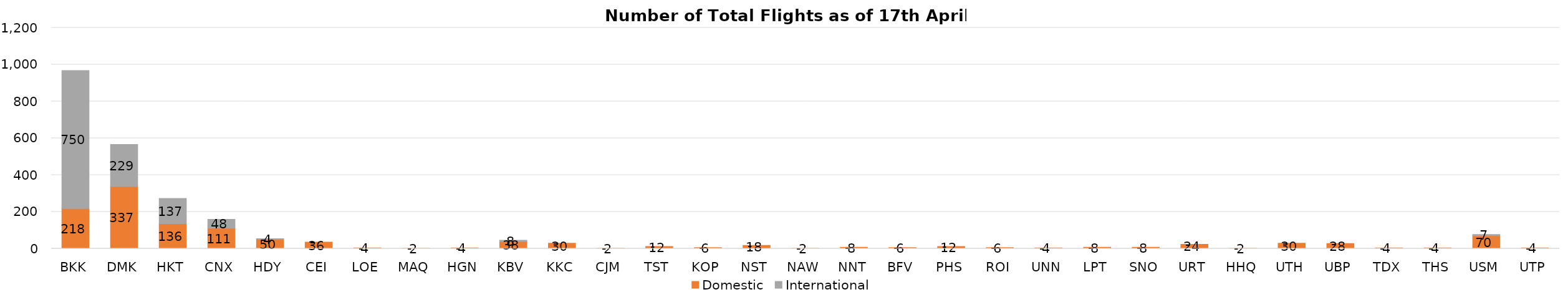
| Category | Domestic | International |
|---|---|---|
| BKK | 218 | 750 |
| DMK | 337 | 229 |
| HKT | 136 | 137 |
| CNX | 111 | 48 |
| HDY | 50 | 4 |
| CEI | 36 | 0 |
| LOE | 4 | 0 |
| MAQ | 2 | 0 |
| HGN | 4 | 0 |
| KBV | 38 | 8 |
| KKC | 30 | 0 |
| CJM | 2 | 0 |
| TST | 12 | 0 |
| KOP | 6 | 0 |
| NST | 18 | 0 |
| NAW | 2 | 0 |
| NNT | 8 | 0 |
| BFV | 6 | 0 |
| PHS | 12 | 0 |
| ROI | 6 | 0 |
| UNN | 4 | 0 |
| LPT | 8 | 0 |
| SNO | 8 | 0 |
| URT | 24 | 0 |
| HHQ | 2 | 0 |
| UTH | 30 | 0 |
| UBP | 28 | 0 |
| TDX | 4 | 0 |
| THS | 4 | 0 |
| USM | 70 | 7 |
| UTP | 4 | 0 |